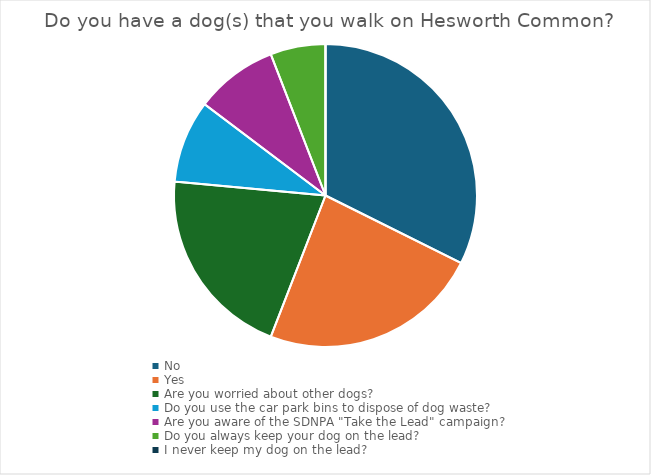
| Category | Series 0 |
|---|---|
| No | 11 |
| Yes | 8 |
| Are you worried about other dogs? | 7 |
| Do you use the car park bins to dispose of dog waste? | 3 |
| Are you aware of the SDNPA "Take the Lead" campaign? | 3 |
| Do you always keep your dog on the lead? | 2 |
| I never keep my dog on the lead? | 0 |